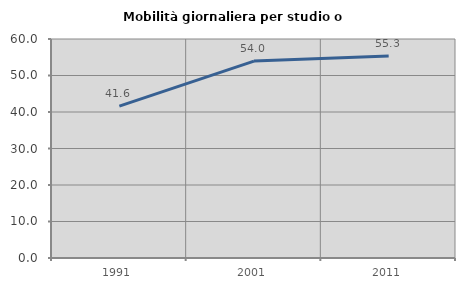
| Category | Mobilità giornaliera per studio o lavoro |
|---|---|
| 1991.0 | 41.596 |
| 2001.0 | 53.956 |
| 2011.0 | 55.346 |